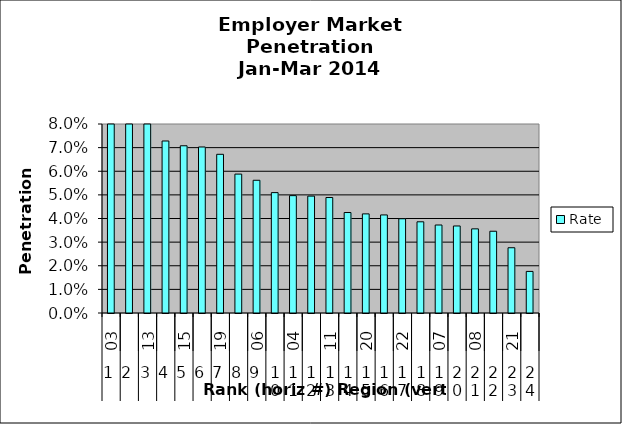
| Category | Rate |
|---|---|
| 0 | 0.115 |
| 1 | 0.111 |
| 2 | 0.107 |
| 3 | 0.073 |
| 4 | 0.071 |
| 5 | 0.07 |
| 6 | 0.067 |
| 7 | 0.059 |
| 8 | 0.056 |
| 9 | 0.051 |
| 10 | 0.05 |
| 11 | 0.049 |
| 12 | 0.049 |
| 13 | 0.043 |
| 14 | 0.042 |
| 15 | 0.042 |
| 16 | 0.04 |
| 17 | 0.039 |
| 18 | 0.037 |
| 19 | 0.037 |
| 20 | 0.036 |
| 21 | 0.035 |
| 22 | 0.028 |
| 23 | 0.018 |